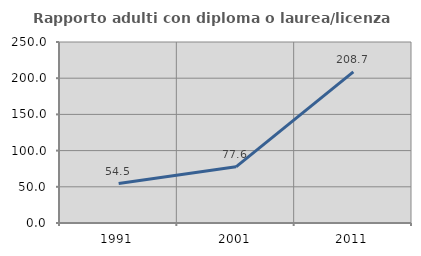
| Category | Rapporto adulti con diploma o laurea/licenza media  |
|---|---|
| 1991.0 | 54.545 |
| 2001.0 | 77.581 |
| 2011.0 | 208.727 |